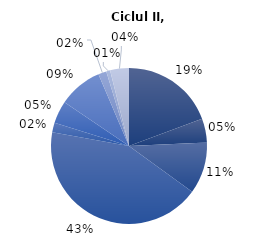
| Category | 2021/22 |
|---|---|
| 0 | 19.3 |
| 1 | 5 |
| 2 | 10.7 |
| 3 | 42.8 |
| 4 | 2 |
| 5 | 4.7 |
| 6 | 9.1 |
| 7 | 1.7 |
| 8 | 0.8 |
| 9 | 3.9 |